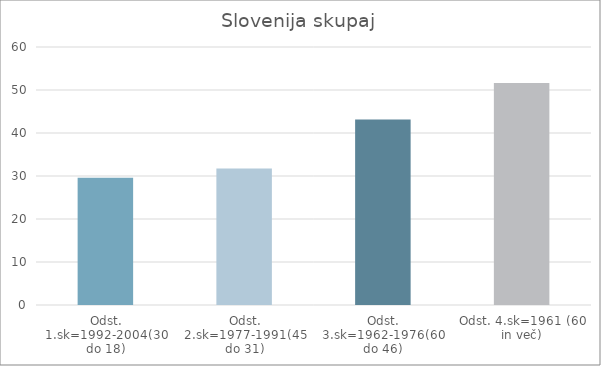
| Category | Series 0 |
|---|---|
| Odst. 1.sk=1992-2004(30 do 18) | 29.57 |
| Odst. 2.sk=1977-1991(45 do 31) | 31.76 |
| Odst. 3.sk=1962-1976(60 do 46) | 43.16 |
| Odst. 4.sk=1961 (60 in več) | 51.65 |